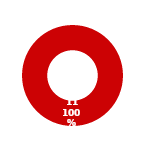
| Category | EDM |
|---|---|
| MIL 2 Complete | 0 |
| MIL 2 Not Complete | 11 |